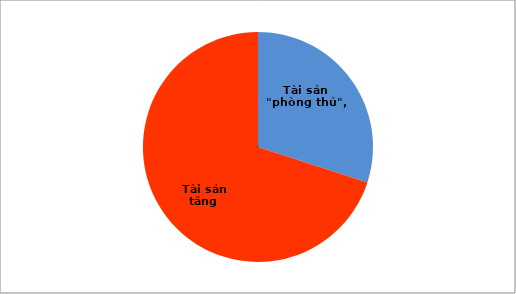
| Category | Series 0 |
|---|---|
| Tài sản "phòng thủ" | 0.3 |
| Tài sản tăng trưởng | 0.7 |